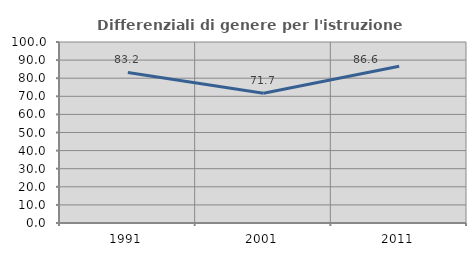
| Category | Differenziali di genere per l'istruzione superiore |
|---|---|
| 1991.0 | 83.195 |
| 2001.0 | 71.684 |
| 2011.0 | 86.629 |